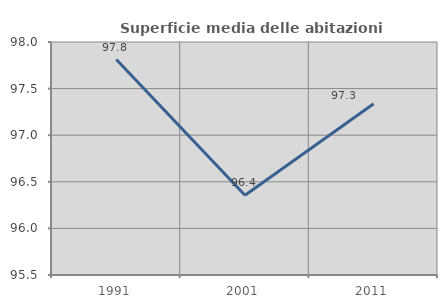
| Category | Superficie media delle abitazioni occupate |
|---|---|
| 1991.0 | 97.812 |
| 2001.0 | 96.356 |
| 2011.0 | 97.338 |